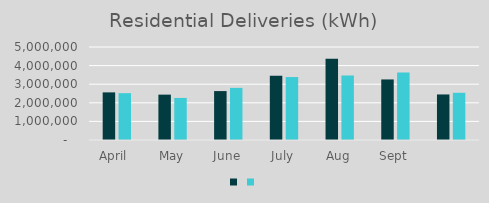
| Category | Series 1 | Series 0 |
|---|---|---|
| April  | 2560197 | 2517652 |
| May | 2439036 | 2261207 |
| June | 2629934 | 2802052 |
| July | 3456641 | 3385366 |
| Aug | 4364840 | 3470448 |
| Sept | 3255766 | 3631455 |